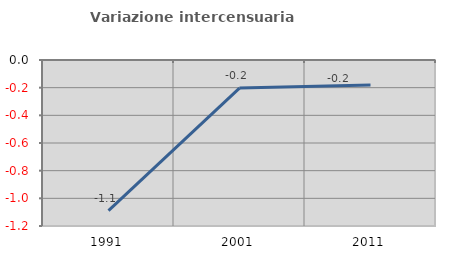
| Category | Variazione intercensuaria annua |
|---|---|
| 1991.0 | -1.089 |
| 2001.0 | -0.203 |
| 2011.0 | -0.181 |